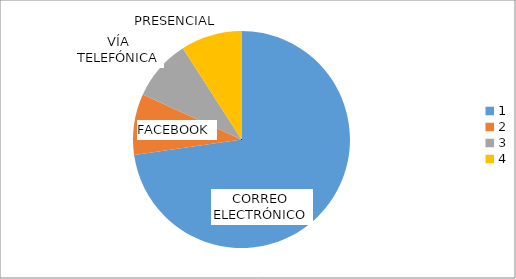
| Category | Series 0 |
|---|---|
| 0 | 16 |
| 1 | 2 |
| 2 | 2 |
| 3 | 2 |